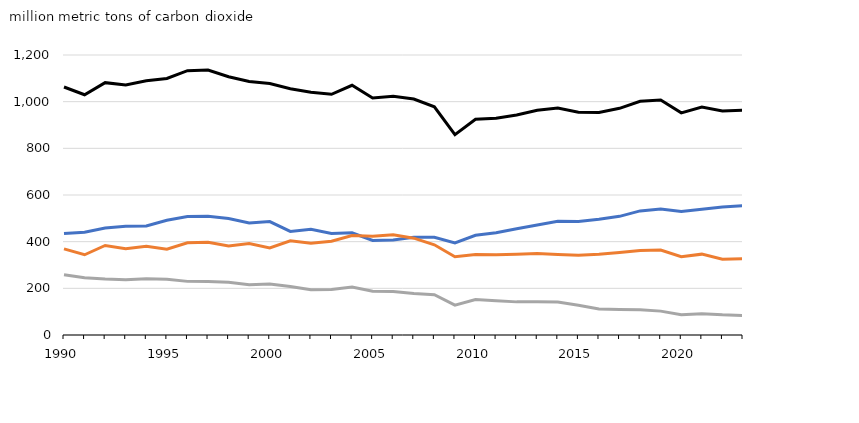
| Category | Series 0 | Series 1 | Series 6 | Series 7 |
|---|---|---|---|---|
| 1990 | 435.071 | 258.57 | 369.139 | 1062.781 |
| 1991 | 440.474 | 245.202 | 343.947 | 1029.623 |
| 1992 | 458.224 | 239.587 | 383.738 | 1081.548 |
| 1993 | 465.879 | 236.338 | 369.723 | 1071.94 |
| 1994 | 467.659 | 241.078 | 380.621 | 1089.358 |
| 1995 | 491.898 | 239.423 | 367.945 | 1099.265 |
| 1996 | 507.686 | 229.821 | 395.325 | 1132.833 |
| 1997 | 509.201 | 229.029 | 397.271 | 1135.5 |
| 1998 | 498.893 | 226.455 | 381.303 | 1106.652 |
| 1999 | 479.62 | 215.126 | 391.645 | 1086.39 |
| 2000 | 486.275 | 218.535 | 372.733 | 1077.542 |
| 2001 | 444.126 | 208.05 | 403.529 | 1055.705 |
| 2002 | 452.913 | 194.265 | 393.124 | 1040.303 |
| 2003 | 434.939 | 194.974 | 401.678 | 1031.591 |
| 2004 | 438.298 | 205.494 | 426.358 | 1070.15 |
| 2005 | 405.378 | 187.309 | 423.327 | 1016.014 |
| 2006 | 407.468 | 186.463 | 429.679 | 1023.61 |
| 2007 | 418.513 | 177.651 | 415.027 | 1011.192 |
| 2008 | 418.844 | 172.694 | 386.516 | 978.054 |
| 2009 | 394.808 | 128.086 | 335.574 | 858.468 |
| 2010 | 427.581 | 151.799 | 345.041 | 924.42 |
| 2011 | 438.07 | 147.101 | 343.762 | 928.933 |
| 2012 | 455.369 | 141.968 | 345.555 | 942.891 |
| 2013 | 471.715 | 142.608 | 348.924 | 963.247 |
| 2014 | 487.238 | 141.063 | 344.846 | 973.148 |
| 2015 | 486.091 | 127.458 | 341.555 | 955.104 |
| 2016 | 495.786 | 111.091 | 346.543 | 953.419 |
| 2017 | 508.527 | 108.953 | 353.931 | 971.411 |
| 2018 | 531.863 | 107.738 | 361.824 | 1001.426 |
| 2019 | 540.295 | 102.319 | 364.327 | 1006.942 |
| 2020 | 529.583 | 86.655 | 335.775 | 952.012 |
| 2021 | 539.038 | 91.594 | 346.525 | 977.157 |
| 2022 | 548.59 | 86.266 | 324.862 | 959.717 |
| 2023 | 553.66 | 83.072 | 326.728 | 963.46 |